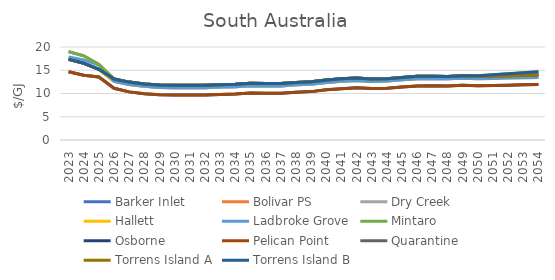
| Category | Barker Inlet | Bolivar PS | Dry Creek | Hallett | Ladbroke Grove | Mintaro | Osborne | Pelican Point | Quarantine | Torrens Island A | Torrens Island B |
|---|---|---|---|---|---|---|---|---|---|---|---|
| 2023.0 | 17.346 | 19.016 | 19.016 | 17.346 | 17.858 | 19.016 | 14.674 | 14.674 | 17.346 | 17.346 | 17.346 |
| 2024.0 | 16.498 | 18.104 | 18.104 | 16.498 | 17.239 | 18.104 | 13.928 | 13.928 | 16.498 | 16.498 | 16.498 |
| 2025.0 | 15.209 | 16.255 | 16.255 | 15.209 | 16.117 | 16.255 | 13.536 | 13.536 | 15.209 | 15.209 | 15.209 |
| 2026.0 | 12.622 | 13.122 | 13.122 | 12.622 | 12.622 | 13.122 | 11.122 | 11.122 | 13.122 | 13.122 | 13.122 |
| 2027.0 | 11.925 | 12.45 | 12.45 | 11.925 | 11.925 | 12.45 | 10.35 | 10.35 | 12.45 | 12.45 | 12.45 |
| 2028.0 | 11.538 | 12.063 | 12.063 | 11.538 | 11.538 | 12.063 | 9.963 | 9.963 | 12.063 | 12.063 | 12.063 |
| 2029.0 | 11.309 | 11.834 | 11.834 | 11.309 | 11.309 | 11.834 | 9.734 | 9.734 | 11.834 | 11.834 | 11.834 |
| 2030.0 | 11.235 | 11.76 | 11.76 | 11.235 | 11.235 | 11.76 | 9.66 | 9.66 | 11.76 | 11.76 | 11.76 |
| 2031.0 | 11.237 | 11.762 | 11.762 | 11.237 | 11.237 | 11.762 | 9.662 | 9.662 | 11.762 | 11.762 | 11.762 |
| 2032.0 | 11.242 | 11.767 | 11.767 | 11.242 | 11.242 | 11.767 | 9.667 | 9.667 | 11.767 | 11.767 | 11.767 |
| 2033.0 | 11.372 | 11.897 | 11.897 | 11.372 | 11.372 | 11.897 | 9.797 | 9.797 | 11.897 | 11.897 | 11.897 |
| 2034.0 | 11.444 | 11.969 | 11.969 | 11.444 | 11.444 | 11.969 | 9.869 | 9.869 | 11.969 | 11.969 | 11.969 |
| 2035.0 | 11.676 | 12.201 | 12.201 | 11.676 | 11.676 | 12.201 | 10.101 | 10.101 | 12.201 | 12.201 | 12.201 |
| 2036.0 | 11.608 | 12.133 | 12.133 | 11.608 | 11.608 | 12.133 | 10.033 | 10.033 | 12.133 | 12.133 | 12.133 |
| 2037.0 | 11.634 | 12.159 | 12.159 | 11.634 | 11.634 | 12.159 | 10.059 | 10.059 | 12.159 | 12.159 | 12.159 |
| 2038.0 | 11.865 | 12.39 | 12.39 | 11.865 | 11.865 | 12.39 | 10.29 | 10.29 | 12.39 | 12.39 | 12.39 |
| 2039.0 | 11.98 | 12.505 | 12.505 | 11.98 | 11.98 | 12.505 | 10.405 | 10.405 | 12.505 | 12.505 | 12.505 |
| 2040.0 | 12.366 | 12.891 | 12.891 | 12.366 | 12.366 | 12.891 | 10.791 | 10.791 | 12.891 | 12.891 | 12.891 |
| 2041.0 | 12.621 | 13.146 | 13.146 | 12.621 | 12.621 | 13.146 | 11.046 | 11.046 | 13.146 | 13.146 | 13.146 |
| 2042.0 | 12.788 | 13.313 | 13.313 | 12.788 | 12.788 | 13.313 | 11.213 | 11.213 | 13.313 | 13.313 | 13.313 |
| 2043.0 | 12.602 | 13.115 | 13.115 | 12.602 | 12.602 | 13.115 | 11.065 | 11.065 | 13.115 | 13.115 | 13.115 |
| 2044.0 | 12.667 | 13.179 | 13.179 | 12.667 | 12.667 | 13.179 | 11.129 | 11.129 | 13.179 | 13.179 | 13.179 |
| 2045.0 | 12.944 | 13.456 | 13.456 | 12.944 | 12.944 | 13.456 | 11.406 | 11.406 | 13.456 | 13.456 | 13.456 |
| 2046.0 | 13.174 | 13.687 | 13.687 | 13.174 | 13.174 | 13.687 | 11.637 | 11.637 | 13.687 | 13.687 | 13.687 |
| 2047.0 | 13.214 | 13.727 | 13.727 | 13.214 | 13.214 | 13.727 | 11.677 | 11.677 | 13.727 | 13.727 | 13.727 |
| 2048.0 | 13.167 | 13.679 | 13.679 | 13.167 | 13.167 | 13.679 | 11.629 | 11.629 | 13.679 | 13.679 | 13.679 |
| 2049.0 | 13.292 | 13.805 | 13.805 | 13.292 | 13.292 | 13.805 | 11.755 | 11.755 | 13.805 | 13.805 | 13.805 |
| 2050.0 | 13.31 | 13.672 | 13.672 | 13.167 | 13.167 | 13.815 | 11.653 | 11.653 | 13.672 | 13.672 | 13.815 |
| 2051.0 | 13.525 | 13.742 | 13.742 | 13.238 | 13.238 | 14.03 | 11.723 | 11.723 | 13.742 | 13.742 | 14.03 |
| 2052.0 | 13.745 | 13.813 | 13.813 | 13.308 | 13.308 | 14.248 | 11.794 | 11.794 | 13.813 | 13.813 | 14.248 |
| 2053.0 | 13.967 | 13.884 | 13.884 | 13.379 | 13.379 | 14.47 | 11.865 | 11.865 | 13.884 | 13.884 | 14.47 |
| 2054.0 | 14.194 | 13.955 | 13.955 | 13.45 | 13.45 | 14.696 | 11.936 | 11.936 | 13.955 | 13.955 | 14.696 |